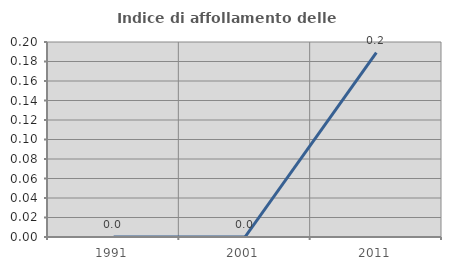
| Category | Indice di affollamento delle abitazioni  |
|---|---|
| 1991.0 | 0 |
| 2001.0 | 0 |
| 2011.0 | 0.189 |